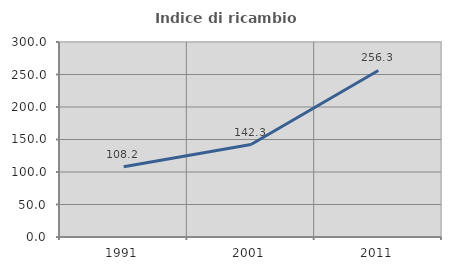
| Category | Indice di ricambio occupazionale  |
|---|---|
| 1991.0 | 108.182 |
| 2001.0 | 142.308 |
| 2011.0 | 256.25 |